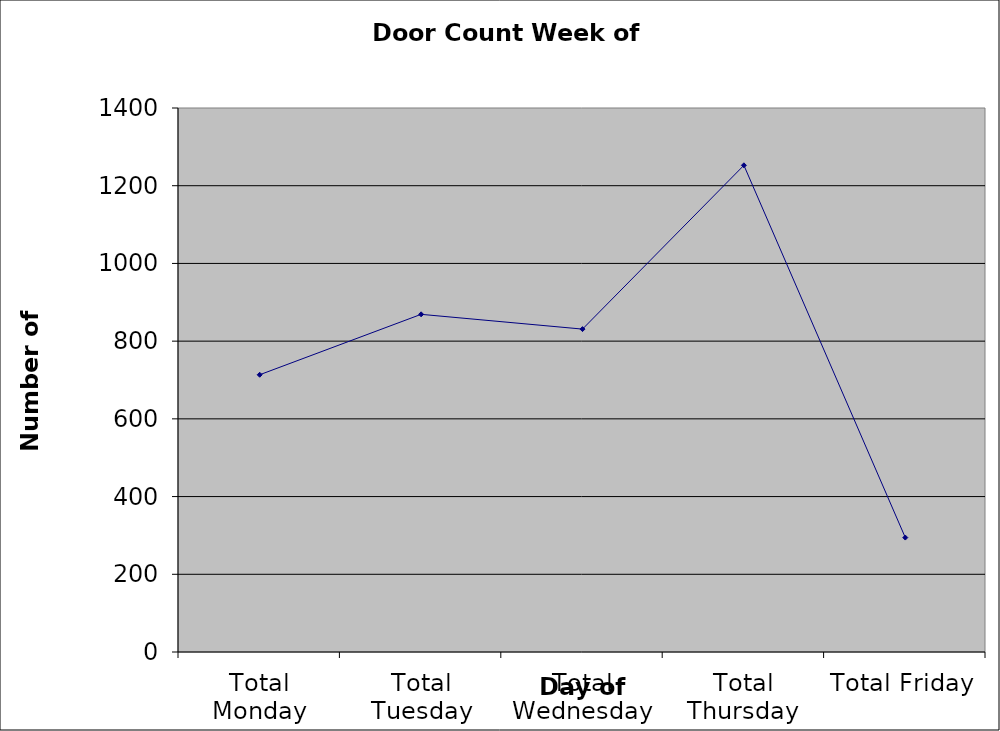
| Category | Series 0 |
|---|---|
| Total Monday | 713.5 |
| Total Tuesday | 869 |
| Total Wednesday | 831 |
| Total Thursday | 1252.5 |
| Total Friday | 294.5 |